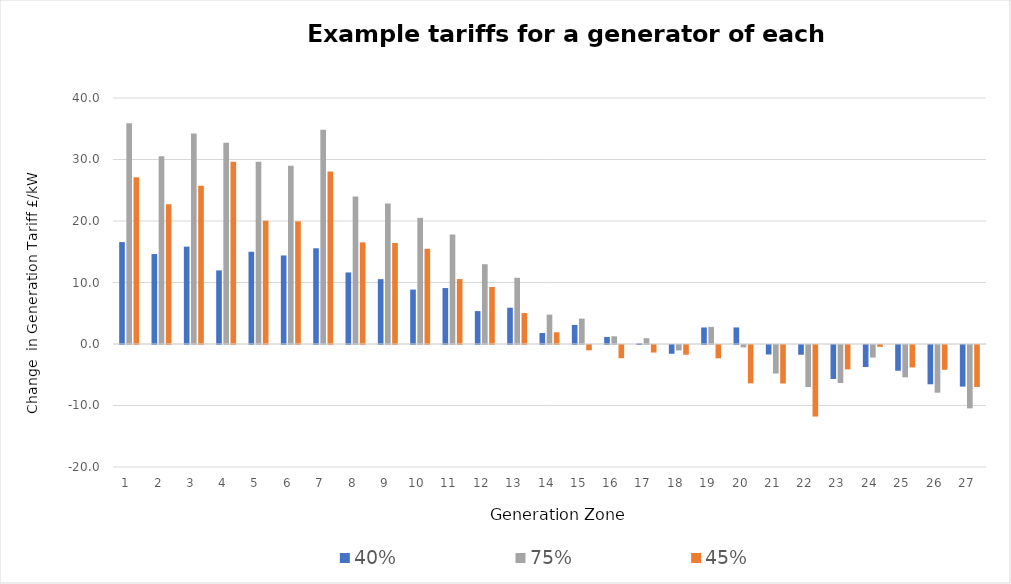
| Category | 40% | 75% | 45% |
|---|---|---|---|
| 1.0 | 16.572 | 35.882 | 27.102 |
| 2.0 | 14.628 | 30.544 | 22.738 |
| 3.0 | 15.83 | 34.217 | 25.724 |
| 4.0 | 11.972 | 32.71 | 29.642 |
| 5.0 | 14.997 | 29.63 | 20.05 |
| 6.0 | 14.397 | 28.964 | 19.946 |
| 7.0 | 15.561 | 34.827 | 28.038 |
| 8.0 | 11.633 | 23.994 | 16.53 |
| 9.0 | 10.544 | 22.836 | 16.424 |
| 10.0 | 8.852 | 20.505 | 15.478 |
| 11.0 | 9.098 | 17.799 | 10.56 |
| 12.0 | 5.349 | 12.968 | 9.281 |
| 13.0 | 5.9 | 10.765 | 5.028 |
| 14.0 | 1.783 | 4.776 | 1.907 |
| 15.0 | 3.099 | 4.131 | -0.863 |
| 16.0 | 1.147 | 1.254 | -2.151 |
| 17.0 | 0.108 | 0.933 | -1.227 |
| 18.0 | -1.424 | -0.882 | -1.591 |
| 19.0 | 2.689 | 2.783 | -2.166 |
| 20.0 | 2.695 | -0.384 | -6.235 |
| 21.0 | -1.543 | -4.643 | -6.261 |
| 22.0 | -1.584 | -6.845 | -11.632 |
| 23.0 | -5.526 | -6.187 | -3.963 |
| 24.0 | -3.587 | -2.045 | -0.294 |
| 25.0 | -4.189 | -5.256 | -3.648 |
| 26.0 | -6.388 | -7.755 | -4.034 |
| 27.0 | -6.763 | -10.304 | -6.828 |